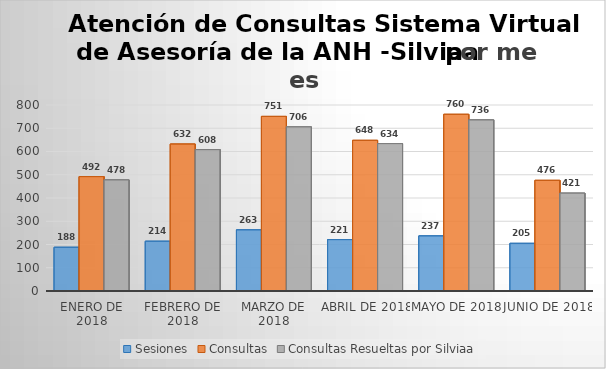
| Category | Sesiones | Consultas | Consultas Resueltas por Silviaa |
|---|---|---|---|
| Enero de 2018 | 188 | 492 | 478 |
| Febrero de 2018 | 214 | 632 | 608 |
| Marzo de 2018 | 263 | 751 | 706 |
| Abril de 2018 | 221 | 648 | 634 |
| Mayo de 2018 | 237 | 760 | 736 |
| Junio de 2018 | 205 | 476 | 421 |